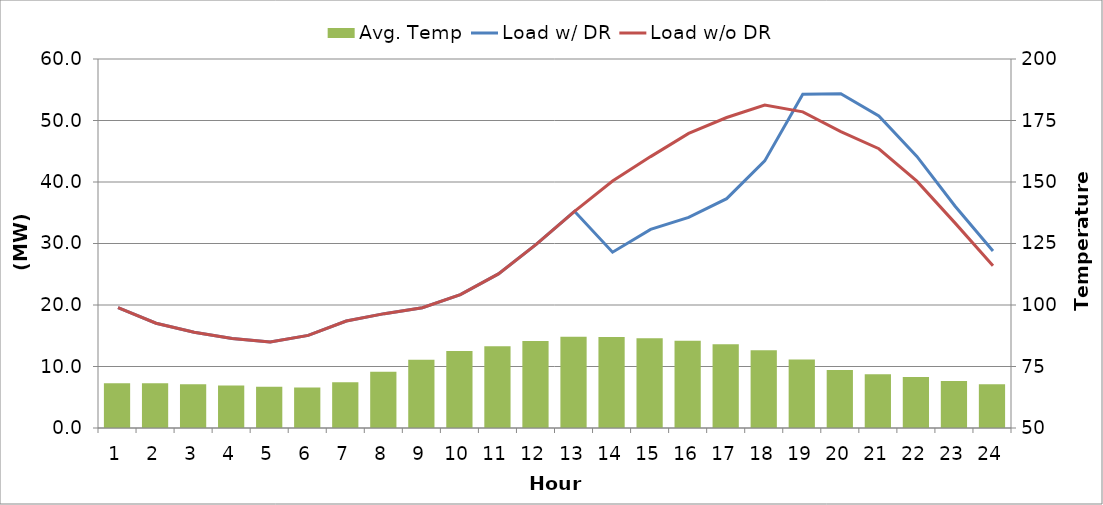
| Category | Avg. Temp |
|---|---|
| 0 | 68.216 |
| 1 | 68.194 |
| 2 | 67.767 |
| 3 | 67.253 |
| 4 | 66.738 |
| 5 | 66.479 |
| 6 | 68.562 |
| 7 | 72.895 |
| 8 | 77.783 |
| 9 | 81.292 |
| 10 | 83.278 |
| 11 | 85.384 |
| 12 | 87.098 |
| 13 | 87.024 |
| 14 | 86.443 |
| 15 | 85.469 |
| 16 | 84.032 |
| 17 | 81.639 |
| 18 | 77.824 |
| 19 | 73.562 |
| 20 | 71.873 |
| 21 | 70.737 |
| 22 | 69.141 |
| 23 | 67.759 |